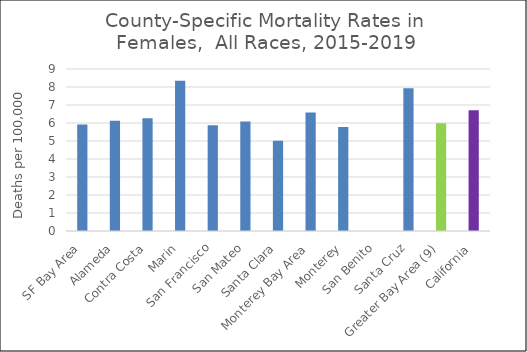
| Category | Female |
|---|---|
| SF Bay Area | 5.92 |
|   Alameda | 6.12 |
|   Contra Costa | 6.26 |
|   Marin | 8.35 |
|   San Francisco | 5.87 |
|   San Mateo | 6.09 |
|   Santa Clara | 5.01 |
| Monterey Bay Area | 6.59 |
|   Monterey | 5.78 |
|   San Benito | 0 |
|   Santa Cruz | 7.93 |
| Greater Bay Area (9) | 5.98 |
| California | 6.71 |